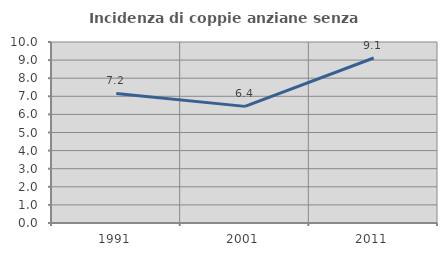
| Category | Incidenza di coppie anziane senza figli  |
|---|---|
| 1991.0 | 7.161 |
| 2001.0 | 6.443 |
| 2011.0 | 9.115 |